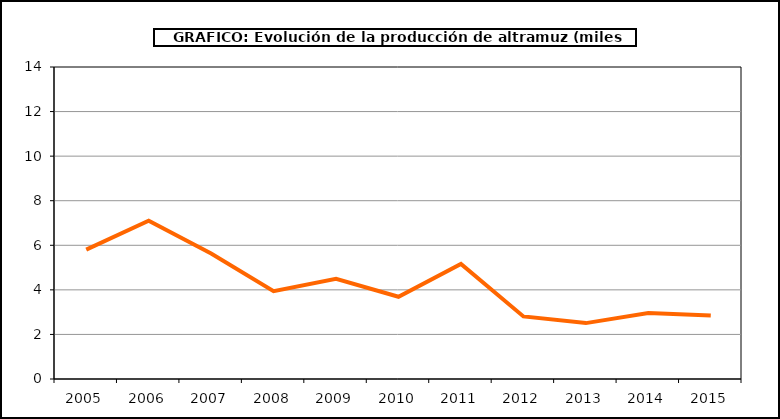
| Category | Producción |
|---|---|
| 2005.0 | 5.808 |
| 2006.0 | 7.1 |
| 2007.0 | 5.629 |
| 2008.0 | 3.938 |
| 2009.0 | 4.492 |
| 2010.0 | 3.689 |
| 2011.0 | 5.166 |
| 2012.0 | 2.807 |
| 2013.0 | 2.508 |
| 2014.0 | 2.963 |
| 2015.0 | 2.847 |